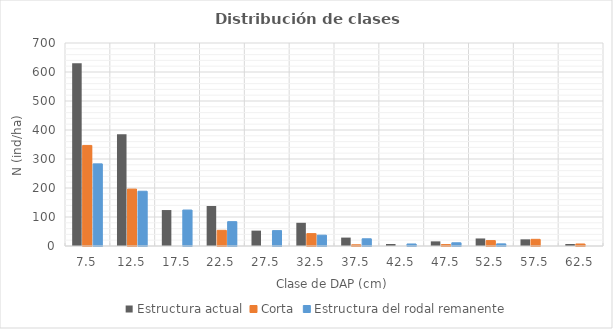
| Category | Estructura actual | Corta | Estructura del rodal remanente |
|---|---|---|---|
| 7.5 | 630 | 346.783 | 283.217 |
| 12.5 | 385 | 196.189 | 188.811 |
| 17.5 | 124 | 0 | 124 |
| 22.5 | 138 | 54.084 | 83.916 |
| 27.5 | 53 | 0 | 53 |
| 32.5 | 80 | 42.704 | 37.296 |
| 37.5 | 29 | 4.136 | 24.864 |
| 42.5 | 7 | 0 | 7 |
| 47.5 | 16 | 4.949 | 11.051 |
| 52.5 | 26 | 18.633 | 7.367 |
| 57.5 | 23 | 23 | 0 |
| 62.5 | 7 | 7 | 0 |